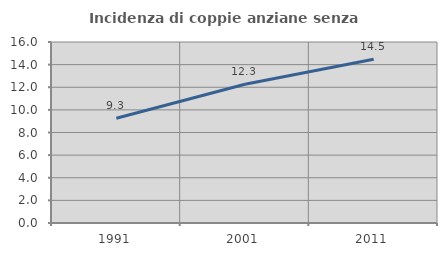
| Category | Incidenza di coppie anziane senza figli  |
|---|---|
| 1991.0 | 9.259 |
| 2001.0 | 12.261 |
| 2011.0 | 14.469 |